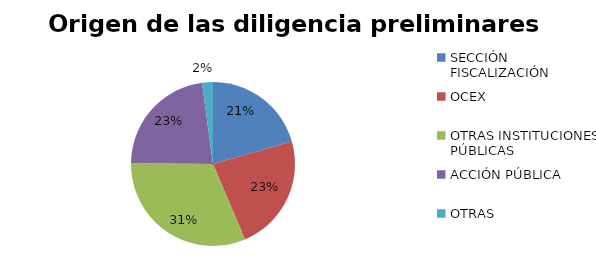
| Category | Series 0 |
|---|---|
| SECCIÓN FISCALIZACIÓN | 58 |
| OCEX | 65 |
| OTRAS INSTITUCIONES PÚBLICAS | 89 |
| ACCIÓN PÚBLICA | 64 |
| OTRAS | 6 |